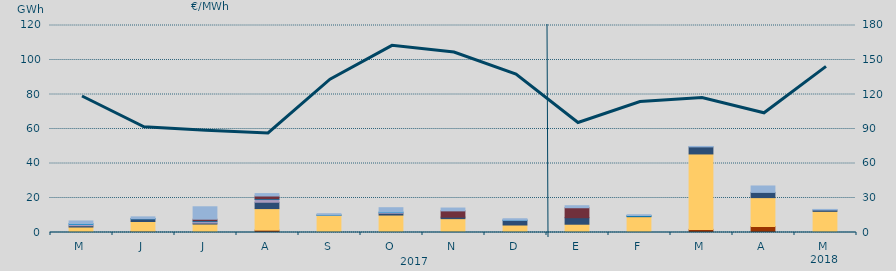
| Category | Carbón | Ciclo Combinado | Consumo Bombeo | Enlace Península Baleares | Eólica | Hidráulica | Internacionales | Solar fotovoltaica | Turbinación bombeo |
|---|---|---|---|---|---|---|---|---|---|
| M | 70 | 3116.9 | 762.7 | 846.6 | 0 | 410 | 0 | 0 | 1489.3 |
| J | 673.2 | 5702.5 | 1567.6 | 28.4 | 0 | 149.4 | 0 | 0 | 940.1 |
| J | 0 | 4906.7 | 593.2 | 844.1 | 0 | 376.7 | 973.2 | 0 | 7214.8 |
| A | 1372.5 | 12488.5 | 3675.7 | 1561.2 | 0 | 359.5 | 1700.4 | 0 | 1397.9 |
| S | 0 | 9962.3 | 123.8 | 0 | 0 | 40 | 0 | 0 | 759.3 |
| O | 0 | 10119.2 | 1038.2 | 495.2 | 0 | 208.4 | 0 | 0 | 2510.5 |
| N | 0 | 8034.3 | 863.8 | 0 | 0 | 0 | 3635.7 | 0 | 1650.6 |
| D | 374 | 3967.2 | 2746.1 | 58.6 | 0 | 52.1 | 0 | 0 | 774.9 |
| E | 0 | 4799.8 | 3776.1 | 0 | 0 | 0 | 5766.5 | 0 | 1181.9 |
| F | 0 | 9167.2 | 319.8 | 0 | 0 | 367.5 | 0 | 0 | 436 |
| M | 1806.7 | 43724.8 | 4108.1 | 0 | 0 | 0 | 0 | 0 | 249 |
| A | 3485.4 | 16735.1 | 3030.8 | 0 | 0 | 0 | 0 | 0 | 3717.6 |
| M | 0 | 12256.8 | 795.1 | 0 | 0 | 0 | 0 | 0 | 330.9 |